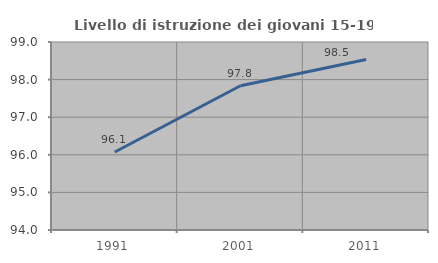
| Category | Livello di istruzione dei giovani 15-19 anni |
|---|---|
| 1991.0 | 96.074 |
| 2001.0 | 97.836 |
| 2011.0 | 98.533 |